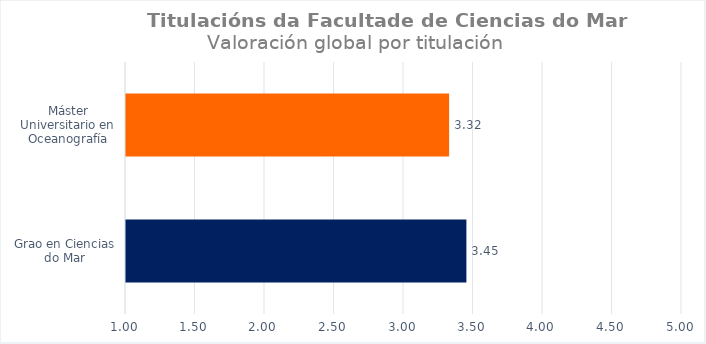
| Category | Series 0 |
|---|---|
| Grao en Ciencias do Mar | 3.449 |
| Máster Universitario en Oceanografía | 3.324 |